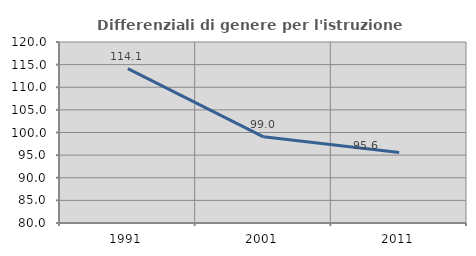
| Category | Differenziali di genere per l'istruzione superiore |
|---|---|
| 1991.0 | 114.118 |
| 2001.0 | 99.049 |
| 2011.0 | 95.567 |